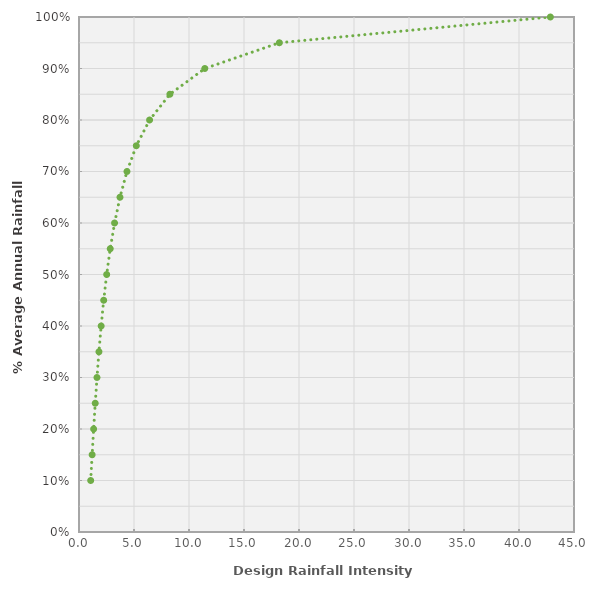
| Category | Cumulative Rainfall |
|---|---|
| 1.0618500945298202 | 0.1 |
| 1.1946080246872006 | 0.15 |
| 1.3310751428751357 | 0.2 |
| 1.476681261601412 | 0.25 |
| 1.6358466113766068 | 0.3 |
| 1.8131500277406876 | 0.35 |
| 2.0139907687456744 | 0.4 |
| 2.245225681203148 | 0.45 |
| 2.516005802426156 | 0.5 |
| 2.839049177583629 | 0.55 |
| 3.232741685731252 | 0.6 |
| 3.724835460241191 | 0.65 |
| 4.359412602308802 | 0.7 |
| 5.211091668389964 | 0.75 |
| 6.417136992380095 | 0.8 |
| 8.260817704139464 | 0.85 |
| 11.436069312096867 | 0.9 |
| 18.215144079756033 | 0.95 |
| 42.85210969932864 | 1 |